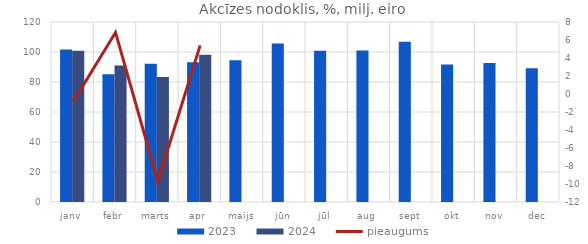
| Category | 2023 | 2024 |
|---|---|---|
| janv | 101.657 | 100.784 |
| febr | 85.2 | 91.033 |
| marts | 92.239 | 83.272 |
| apr | 93.144 | 98.179 |
| maijs | 94.582 | 0 |
| jūn | 105.706 | 0 |
| jūl | 100.823 | 0 |
| aug | 101.01 | 0 |
| sept | 106.898 | 0 |
| okt | 91.658 | 0 |
| nov | 92.614 | 0 |
| dec | 89.239 | 0 |